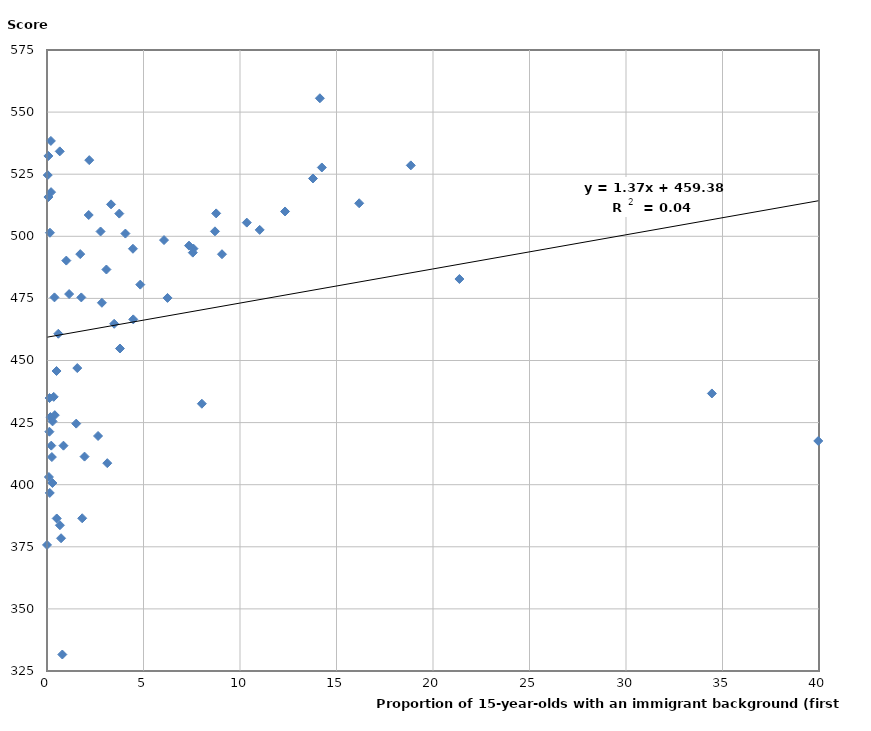
| Category | Percentage of immigrant population |
|---|---|
| 0.1760869826076923 | 427.225 |
| 0.0 | 375.745 |
| 12.33380658129383 | 509.994 |
| 7.58757577114184 | 495.037 |
| 8.702268035339285 | 502 |
| 0.2810213660429476 | 400.682 |
| 0.2112079801450863 | 517.779 |
| 0.4941397112907449 | 445.772 |
| 6.244675826470115 | 475.187 |
| 14.24051200248923 | 527.705 |
| 1.569405301813017 | 446.956 |
| 0.0721400971970408 | 532.347 |
| 0.221418699320598 | 415.729 |
| 2.644305028838371 | 419.608 |
| 1.777938614823884 | 475.391 |
| 8.02321158148101 | 432.596 |
| 1.722523136537139 | 492.83 |
| 2.774527392137942 | 501.937 |
| 0.7935455015831235 | 331.639 |
| 0.6610926861752593 | 534.194 |
| 2.188531322308908 | 530.661 |
| 4.453806447929975 | 494.978 |
| 0.6694973499563964 | 383.682 |
| 0.2524042718375897 | 411.132 |
| 3.745173453108937 | 509.141 |
| 3.781028508264257 | 454.829 |
| 13.78118207451682 | 523.277 |
| 1.146463169466971 | 476.748 |
| 2.845600893509338 | 473.23 |
| 0.0994853024395687 | 403.1 |
| 11.02047557235061 | 502.575 |
| 4.46852388816893 | 466.553 |
| 4.833471738432718 | 480.547 |
| 0.2010064461248745 | 538.395 |
| 3.123050247846257 | 408.669 |
| 0.074472509930871 | 515.81 |
| 0.7278288179870154 | 378.442 |
| 1.001261325064074 | 490.225 |
| 1.824204147202587 | 386.485 |
| 0.3862300094520992 | 475.409 |
| 21.36965369101559 | 482.806 |
| 18.85109717531345 | 528.55 |
| 3.48197751503595 | 464.782 |
| 0.8525821771621614 | 415.71 |
| 0.4041495507634719 | 427.998 |
| 1.945653676251453 | 411.314 |
| 2.161670832620666 | 508.575 |
| 16.17587084931503 | 513.304 |
| 6.063432097466262 | 498.481 |
| 0.1440217804744107 | 396.684 |
| 0.1542038333471194 | 501.435 |
| 4.061846972159528 | 501.1 |
| 39.96225934958525 | 417.611 |
| 0.1326403921753025 | 434.885 |
| 3.078174709915335 | 486.631 |
| 14.13914422977747 | 555.575 |
| 0.5864037152696319 | 460.775 |
| 3.317780763843214 | 512.864 |
| 9.065784192765896 | 492.786 |
| 7.555655750259651 | 493.422 |
| 10.35168246799185 | 505.506 |
| 0.1243966738425838 | 421.337 |
| 1.513895114069166 | 424.59 |
| 0.5043058204408098 | 386.403 |
| 0.2891408293405121 | 425.49 |
| 34.44990511633814 | 436.731 |
| 8.764397639146145 | 509.222 |
| 7.359020344141013 | 496.242 |
| 0.3473316682626393 | 435.363 |
| 0.0377545674163466 | 524.645 |